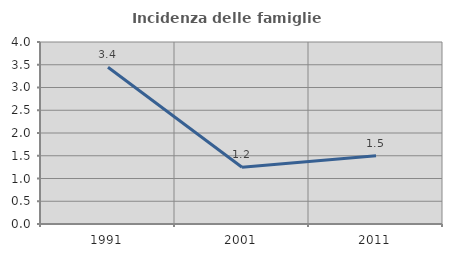
| Category | Incidenza delle famiglie numerose |
|---|---|
| 1991.0 | 3.445 |
| 2001.0 | 1.248 |
| 2011.0 | 1.502 |